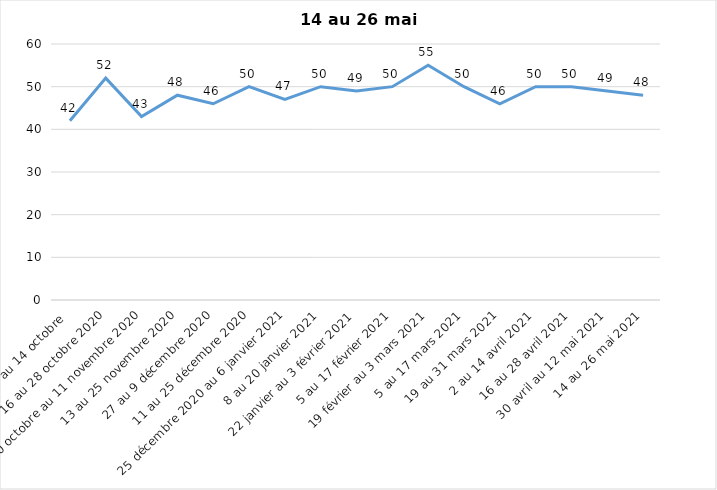
| Category | Toujours aux trois mesures |
|---|---|
| 2 au 14 octobre  | 42 |
| 16 au 28 octobre 2020 | 52 |
| 30 octobre au 11 novembre 2020 | 43 |
| 13 au 25 novembre 2020 | 48 |
| 27 au 9 décembre 2020 | 46 |
| 11 au 25 décembre 2020 | 50 |
| 25 décembre 2020 au 6 janvier 2021 | 47 |
| 8 au 20 janvier 2021 | 50 |
| 22 janvier au 3 février 2021 | 49 |
| 5 au 17 février 2021 | 50 |
| 19 février au 3 mars 2021 | 55 |
| 5 au 17 mars 2021 | 50 |
| 19 au 31 mars 2021 | 46 |
| 2 au 14 avril 2021 | 50 |
| 16 au 28 avril 2021 | 50 |
| 30 avril au 12 mai 2021 | 49 |
| 14 au 26 mai 2021 | 48 |